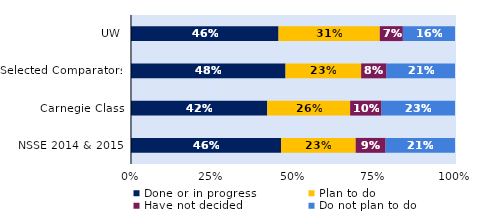
| Category | Done or in progress | Plan to do | Have not decided | Do not plan to do |
|---|---|---|---|---|
| UW | 0.455 | 0.312 | 0.071 | 0.161 |
| Selected Comparators | 0.477 | 0.233 | 0.079 | 0.211 |
| Carnegie Class | 0.421 | 0.256 | 0.097 | 0.227 |
| NSSE 2014 & 2015 | 0.463 | 0.23 | 0.092 | 0.214 |